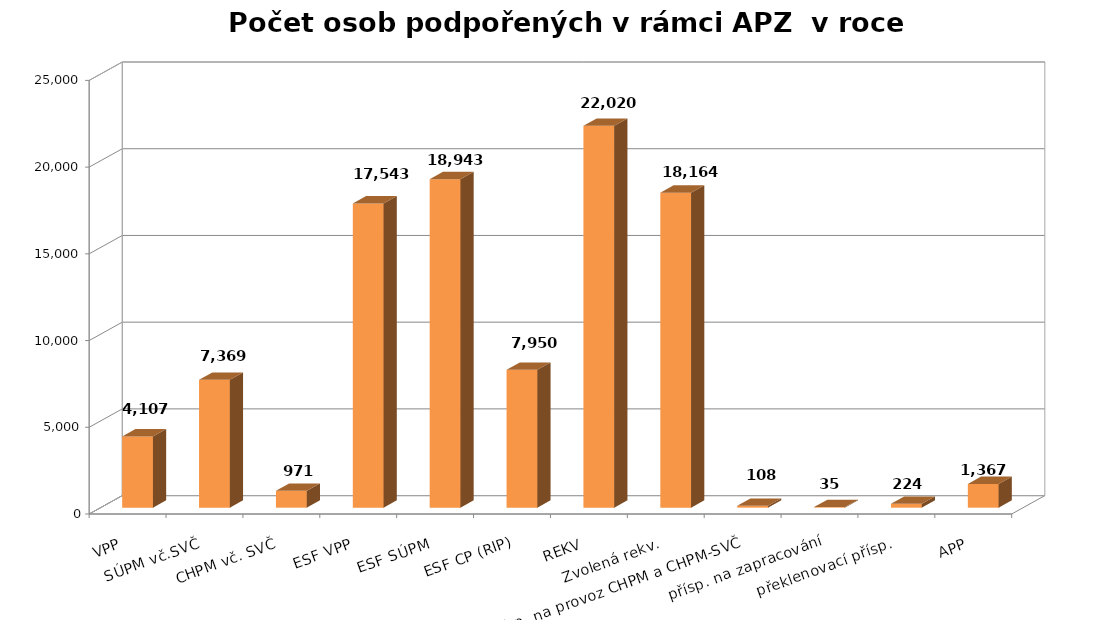
| Category | Series 0 |
|---|---|
| VPP | 4107 |
| SÚPM vč.SVČ | 7369 |
| CHPM vč. SVČ | 971 |
| ESF VPP | 17543 |
| ESF SÚPM | 18943 |
| ESF CP (RIP) | 7950 |
| REKV | 22020 |
| Zvolená rekv. | 18164 |
| přísp. na provoz CHPM a CHPM-SVČ | 108 |
| přísp. na zapracování | 35 |
| překlenovací přísp. | 224 |
| APP | 1367 |